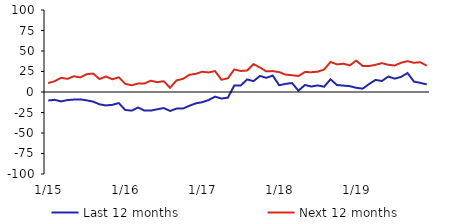
| Category | Last 12 months | Next 12 months |
|---|---|---|
|  1/15 | -10.32 | 10.88 |
|  2/15 | -9.55 | 13.1 |
|  3/15 | -11.45 | 17.32 |
|  4/15 | -9.85 | 16.04 |
|  5/15 | -9.22 | 19.19 |
|  6/15 | -8.99 | 17.77 |
|  7/15 | -10.2 | 21.74 |
|  8/15 | -11.76 | 22.49 |
|  9/15 | -15.03 | 15.86 |
|  10/15 | -16.38 | 18.89 |
|  11/15 | -15.64 | 15.55 |
|  12/15 | -13.49 | 17.84 |
|  1/16 | -21.91 | 10.03 |
|  2/16 | -22.72 | 8.16 |
|  3/16 | -18.91 | 10.34 |
|  4/16 | -22.65 | 10.48 |
|  5/16 | -22.69 | 13.73 |
|  6/16 | -21.05 | 11.99 |
|  7/16 | -19.56 | 13.15 |
|  8/16 | -23.1 | 5.15 |
|  9/16 | -20.21 | 14.17 |
|  10/16 | -20.19 | 16 |
|  11/16 | -16.81 | 20.99 |
|  12/16 | -13.84 | 22.19 |
|  1/17 | -12.4 | 24.7 |
|  2/17 | -9.79 | 23.87 |
|  3/17 | -5.67 | 25.48 |
|  4/17 | -8.04 | 14.94 |
|  5/17 | -6.9 | 16.78 |
|  6/17 | 7.95 | 27.5 |
|  7/17 | 7.9 | 25.66 |
|  8/17 | 15.28 | 26.2 |
|  9/17 | 13.3 | 34.02 |
|  10/17 | 19.64 | 29.89 |
|  11/17 | 17.29 | 25.16 |
|  12/17 | 20.01 | 25.53 |
|  1/18 | 8.26 | 24.23 |
|  2/18 | 9.94 | 21.21 |
|  3/18 | 10.91 | 20.44 |
|  4/18 | 1.56 | 19.52 |
|  5/18 | 8.57 | 24.34 |
|  6/18 | 6.65 | 24.16 |
|  7/18 | 8.04 | 24.79 |
|  8/18 | 6.42 | 27.41 |
|  9/18 | 15.48 | 36.69 |
|  10/18 | 8.47 | 33.68 |
|  11/18 | 7.83 | 34.44 |
|  12/18 | 7.09 | 32.48 |
|  1/19 | 5.17 | 38.27 |
|  2/19 | 4.08 | 31.81 |
|  3/19 | 9.64 | 31.65 |
|  4/19 | 14.75 | 33.17 |
|  5/19 | 13.42 | 35.21 |
|  6/19 | 18.83 | 33.2 |
|  7/19 | 16.3 | 32.33 |
|  8/19 | 18.42 | 35.7 |
|  9/19 | 23.07 | 37.61 |
|  10/19 | 12.67 | 35.65 |
|  11/19 | 11.15 | 36.29 |
|  12/19 | 9.22 | 32.02 |